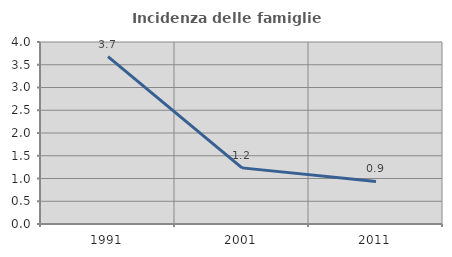
| Category | Incidenza delle famiglie numerose |
|---|---|
| 1991.0 | 3.68 |
| 2001.0 | 1.233 |
| 2011.0 | 0.935 |